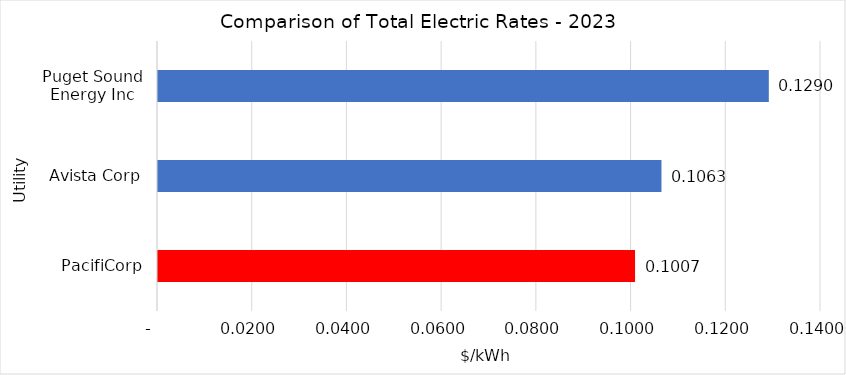
| Category | Series 0 |
|---|---|
| PacifiCorp | 0.101 |
| Avista Corp | 0.106 |
| Puget Sound Energy Inc | 0.129 |